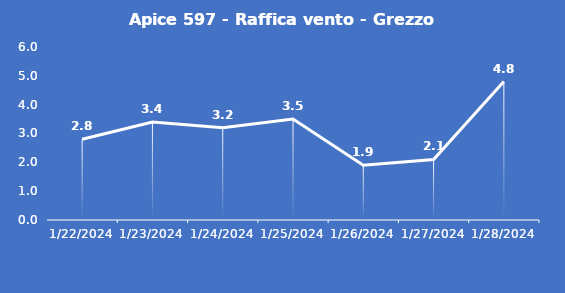
| Category | Apice 597 - Raffica vento - Grezzo (m/s) |
|---|---|
| 1/22/24 | 2.8 |
| 1/23/24 | 3.4 |
| 1/24/24 | 3.2 |
| 1/25/24 | 3.5 |
| 1/26/24 | 1.9 |
| 1/27/24 | 2.1 |
| 1/28/24 | 4.8 |